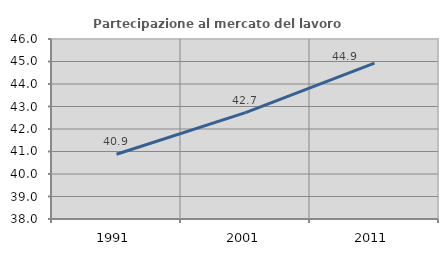
| Category | Partecipazione al mercato del lavoro  femminile |
|---|---|
| 1991.0 | 40.876 |
| 2001.0 | 42.725 |
| 2011.0 | 44.924 |